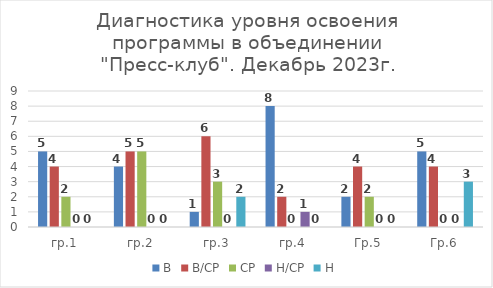
| Category | В | В/СР | СР | Н/СР | Н |
|---|---|---|---|---|---|
| гр.1 | 5 | 4 | 2 | 0 | 0 |
| гр.2 | 4 | 5 | 5 | 0 | 0 |
| гр.3 | 1 | 6 | 3 | 0 | 2 |
| гр.4 | 8 | 2 | 0 | 1 | 0 |
| Гр.5 | 2 | 4 | 2 | 0 | 0 |
| Гр.6 | 5 | 4 | 0 | 0 | 3 |